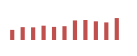
| Category | Importações (2) |
|---|---|
| 0 | 63256.661 |
| 1 | 80362.628 |
| 2 | 79098.748 |
| 3 | 89493.365 |
| 4 | 81914.569 |
| 5 | 86371.3 |
| 6 | 122399.001 |
| 7 | 125153.991 |
| 8 | 116754.909 |
| 9 | 109963.905 |
| 10 | 137123.28 |